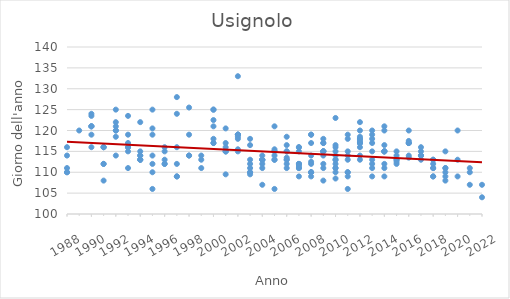
| Category | Series 0 |
|---|---|
| 1988.0 | 116 |
| 1988.0 | 110 |
| 1988.0 | 111 |
| 1988.0 | 110 |
| 1988.0 | 114 |
| 1989.0 | 120 |
| 1990.0 | 119 |
| 1990.0 | 116 |
| 1990.0 | 121 |
| 1990.0 | 121 |
| 1990.0 | 124 |
| 1990.0 | 123.5 |
| 1990.0 | 121 |
| 1991.0 | 116 |
| 1991.0 | 116 |
| 1991.0 | 116 |
| 1991.0 | 112 |
| 1991.0 | 108 |
| 1991.0 | 112 |
| 1992.0 | 120 |
| 1992.0 | 121 |
| 1992.0 | 120 |
| 1992.0 | 125 |
| 1992.0 | 118.5 |
| 1992.0 | 122 |
| 1992.0 | 114 |
| 1993.0 | 116 |
| 1993.0 | 123.5 |
| 1993.0 | 116 |
| 1993.0 | 117 |
| 1993.0 | 115 |
| 1993.0 | 119 |
| 1993.0 | 111 |
| 1994.0 | 113 |
| 1994.0 | 122 |
| 1994.0 | 113 |
| 1994.0 | 113 |
| 1994.0 | 114 |
| 1994.0 | 115 |
| 1994.0 | 114 |
| 1995.0 | 110 |
| 1995.0 | 125 |
| 1995.0 | 112 |
| 1995.0 | 120.5 |
| 1995.0 | 106 |
| 1995.0 | 114 |
| 1995.0 | 119 |
| 1996.0 | 112 |
| 1996.0 | 115 |
| 1996.0 | 116 |
| 1996.0 | 113 |
| 1996.0 | 112 |
| 1997.0 | 109 |
| 1997.0 | 112 |
| 1997.0 | 124 |
| 1997.0 | 128 |
| 1997.0 | 116 |
| 1997.0 | 109 |
| 1998.0 | 125.5 |
| 1998.0 | 119 |
| 1998.0 | 114 |
| 1998.0 | 114 |
| 1999.0 | 114 |
| 1999.0 | 113 |
| 1999.0 | 111 |
| 2000.0 | 125 |
| 2000.0 | 125 |
| 2000.0 | 117 |
| 2000.0 | 121 |
| 2000.0 | 118 |
| 2000.0 | 117 |
| 2000.0 | 122.5 |
| 2001.0 | 115 |
| 2001.0 | 117 |
| 2001.0 | 109.5 |
| 2001.0 | 115 |
| 2001.0 | 120.5 |
| 2001.0 | 116 |
| 2001.0 | 115 |
| 2002.0 | 119 |
| 2002.0 | 133 |
| 2002.0 | 119 |
| 2002.0 | 119 |
| 2002.0 | 118 |
| 2002.0 | 115.5 |
| 2002.0 | 115 |
| 2002.0 | 119 |
| 2002.0 | 118.5 |
| 2003.0 | 110 |
| 2003.0 | 118 |
| 2003.0 | 112 |
| 2003.0 | 113 |
| 2003.0 | 111 |
| 2003.0 | 116.5 |
| 2003.0 | 110 |
| 2003.0 | 109.5 |
| 2004.0 | 113 |
| 2004.0 | 113 |
| 2004.0 | 107 |
| 2004.0 | 114 |
| 2004.0 | 113 |
| 2004.0 | 112 |
| 2004.0 | 113 |
| 2004.0 | 111 |
| 2005.0 | 113 |
| 2005.0 | 106 |
| 2005.0 | 121 |
| 2005.0 | 115 |
| 2005.0 | 115.5 |
| 2005.0 | 113 |
| 2005.0 | 115 |
| 2005.0 | 114 |
| 2006.0 | 118.5 |
| 2006.0 | 112 |
| 2006.0 | 111 |
| 2006.0 | 113.5 |
| 2006.0 | 116.5 |
| 2006.0 | 115 |
| 2006.0 | 115 |
| 2006.0 | 113 |
| 2006.0 | 113 |
| 2007.0 | 109 |
| 2007.0 | 112 |
| 2007.0 | 116 |
| 2007.0 | 111.5 |
| 2007.0 | 116 |
| 2007.0 | 112 |
| 2007.0 | 115 |
| 2007.0 | 111 |
| 2007.0 | 111 |
| 2007.0 | 112 |
| 2008.0 | 110 |
| 2008.0 | 119 |
| 2008.0 | 109 |
| 2008.0 | 110 |
| 2008.0 | 112 |
| 2008.0 | 114 |
| 2008.0 | 117 |
| 2008.0 | 110 |
| 2008.0 | 119 |
| 2008.0 | 112.5 |
| 2009.0 | 112 |
| 2009.0 | 111 |
| 2009.0 | 115 |
| 2009.0 | 115 |
| 2009.0 | 108 |
| 2009.0 | 117 |
| 2009.0 | 117 |
| 2009.0 | 115 |
| 2009.0 | 115 |
| 2009.0 | 114 |
| 2009.0 | 118 |
| 2010.0 | 114 |
| 2010.0 | 113 |
| 2010.0 | 108.5 |
| 2010.0 | 123 |
| 2010.0 | 111 |
| 2010.0 | 116.5 |
| 2010.0 | 115 |
| 2010.0 | 116 |
| 2010.0 | 110 |
| 2010.0 | 111 |
| 2010.0 | 113 |
| 2010.0 | 112 |
| 2011.0 | 110 |
| 2011.0 | 114 |
| 2011.0 | 110 |
| 2011.0 | 106 |
| 2011.0 | 118 |
| 2011.0 | 119 |
| 2011.0 | 109 |
| 2011.0 | 113 |
| 2011.0 | 115 |
| 2012.0 | 117 |
| 2012.0 | 122 |
| 2012.0 | 118 |
| 2012.0 | 117 |
| 2012.0 | 120 |
| 2012.0 | 117 |
| 2012.0 | 113 |
| 2012.0 | 117.5 |
| 2012.0 | 116 |
| 2012.0 | 118 |
| 2012.0 | 118.5 |
| 2012.0 | 114 |
| 2013.0 | 109 |
| 2013.0 | 120 |
| 2013.0 | 112 |
| 2013.0 | 119 |
| 2013.0 | 117 |
| 2013.0 | 113 |
| 2013.0 | 111 |
| 2013.0 | 115 |
| 2013.0 | 118 |
| 2014.0 | 121 |
| 2014.0 | 111 |
| 2014.0 | 115 |
| 2014.0 | 115 |
| 2014.0 | 115 |
| 2014.0 | 120 |
| 2014.0 | 116.5 |
| 2014.0 | 115 |
| 2014.0 | 112 |
| 2014.0 | 109 |
| 2015.0 | 113 |
| 2015.0 | 112.5 |
| 2015.0 | 115 |
| 2015.0 | 114 |
| 2015.0 | 113 |
| 2015.0 | 112 |
| 2016.0 | 117 |
| 2016.0 | 117 |
| 2016.0 | 114 |
| 2016.0 | 120 |
| 2016.0 | 117 |
| 2016.0 | 113.5 |
| 2016.0 | 117.5 |
| 2017.0 | 115 |
| 2017.0 | 114 |
| 2017.0 | 114 |
| 2017.0 | 114 |
| 2017.0 | 116 |
| 2017.0 | 113 |
| 2018.0 | 109 |
| 2018.0 | 112 |
| 2018.0 | 113 |
| 2018.0 | 109 |
| 2018.0 | 111 |
| 2018.0 | 113 |
| 2018.0 | 111 |
| 2019.0 | 111 |
| 2019.0 | 109 |
| 2019.0 | 110 |
| 2019.0 | 108 |
| 2019.0 | 111 |
| 2019.0 | 115 |
| 2020.0 | 109 |
| 2020.0 | 113 |
| 2020.0 | 120 |
| 2021.0 | 111 |
| 2021.0 | 110 |
| 2021.0 | 107 |
| 2022.0 | 104 |
| 2022.0 | 107 |